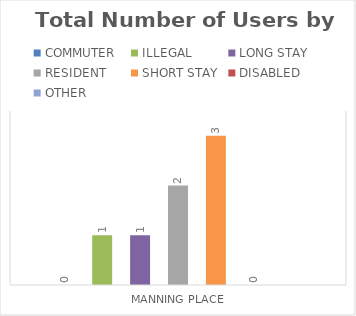
| Category | COMMUTER | ILLEGAL | LONG STAY | RESIDENT | SHORT STAY | DISABLED | OTHER |
|---|---|---|---|---|---|---|---|
| MANNING PLACE | 0 | 1 | 1 | 2 | 3 | 0 | 0 |